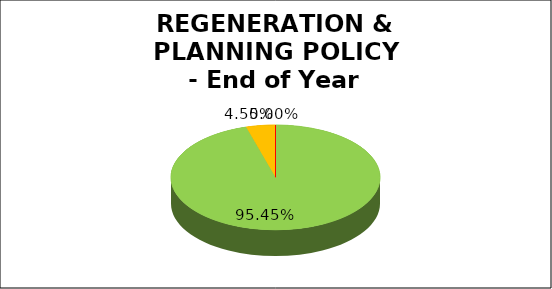
| Category | Q4 |
|---|---|
| Green | 0.955 |
| Amber | 0.045 |
| Red | 0 |